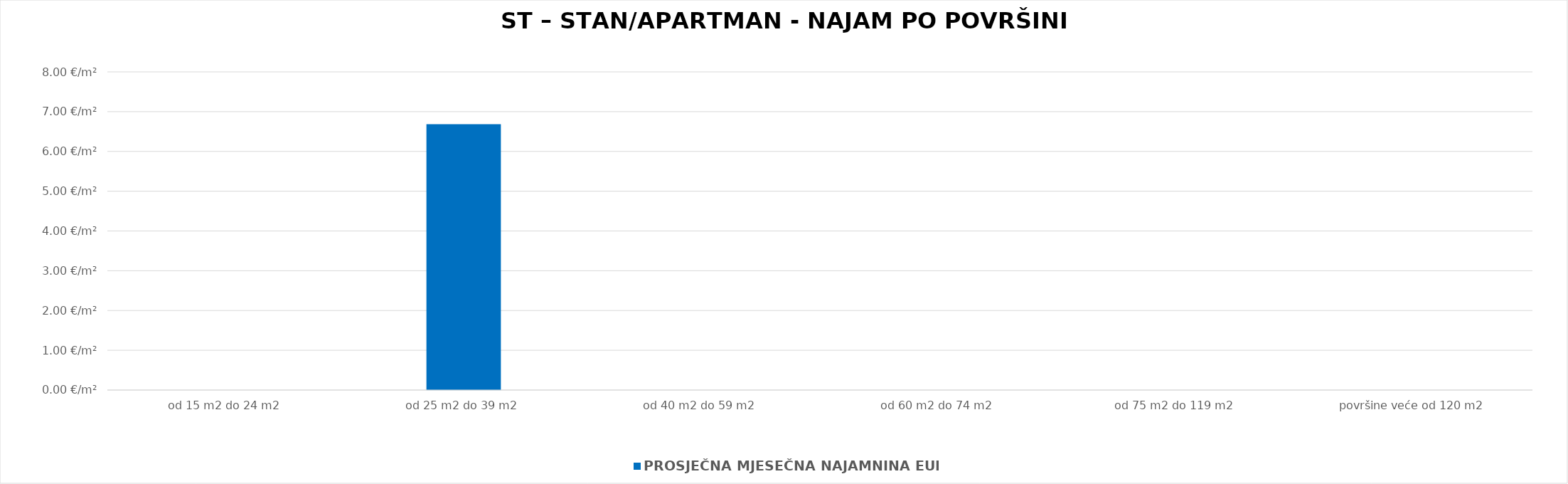
| Category | PROSJEČNA MJESEČNA NAJAMNINA EUR/m² |
|---|---|
| od 15 m2 do 24 m2 | 0 |
| od 25 m2 do 39 m2 | 1900-01-06 16:27:31 |
| od 40 m2 do 59 m2 | 0 |
| od 60 m2 do 74 m2 | 0 |
| od 75 m2 do 119 m2 | 0 |
| površine veće od 120 m2 | 0 |